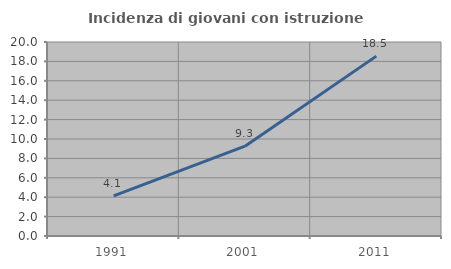
| Category | Incidenza di giovani con istruzione universitaria |
|---|---|
| 1991.0 | 4.144 |
| 2001.0 | 9.259 |
| 2011.0 | 18.544 |